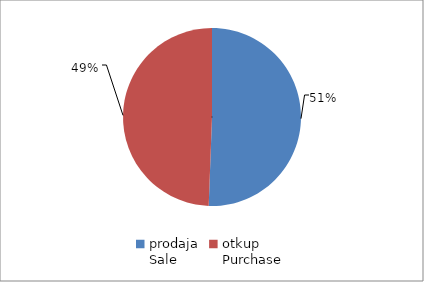
| Category | Series 0 |
|---|---|
| prodaja
Sale | 12755418.06 |
| otkup
Purchase | 12458043.05 |